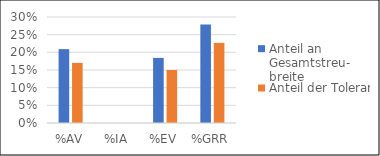
| Category | Anteil an Gesamtstreu- breite | Anteil der Toleranz |
|---|---|---|
| %AV | 0.209 | 0.17 |
| %IA | 0 | 0 |
| %EV | 0.184 | 0.15 |
| %GRR | 0.279 | 0.227 |